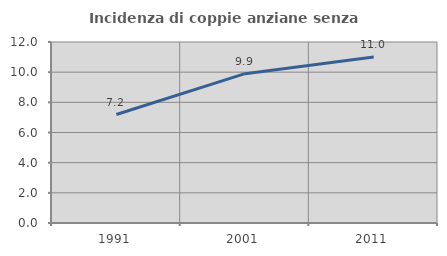
| Category | Incidenza di coppie anziane senza figli  |
|---|---|
| 1991.0 | 7.192 |
| 2001.0 | 9.9 |
| 2011.0 | 11.011 |